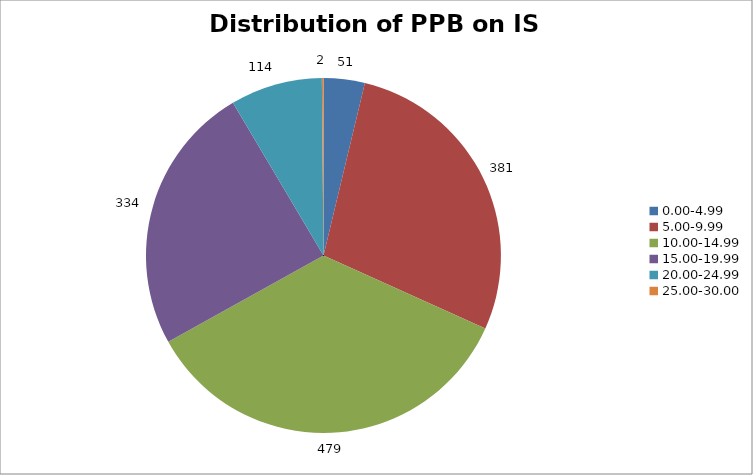
| Category | Series 0 |
|---|---|
| 0.00-4.99 | 51 |
| 5.00-9.99 | 381 |
| 10.00-14.99 | 479 |
| 15.00-19.99 | 334 |
| 20.00-24.99 | 114 |
| 25.00-30.00 | 2 |